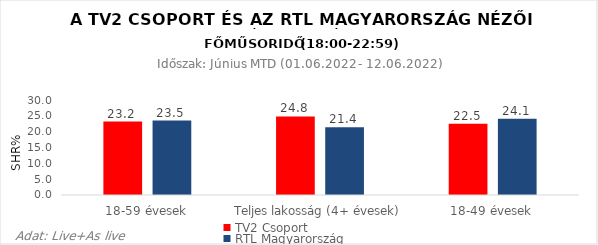
| Category | TV2 Csoport | RTL Magyarország |
|---|---|---|
| 18-59 évesek | 23.2 | 23.5 |
| Teljes lakosság (4+ évesek) | 24.8 | 21.4 |
| 18-49 évesek | 22.5 | 24.1 |